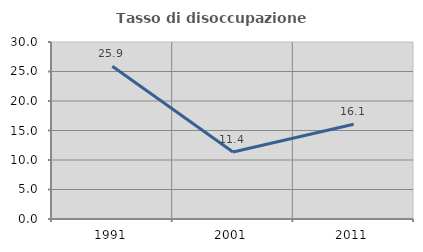
| Category | Tasso di disoccupazione giovanile  |
|---|---|
| 1991.0 | 25.874 |
| 2001.0 | 11.364 |
| 2011.0 | 16.071 |